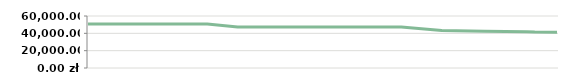
| Category | KWARTAŁ   |
|---|---|
| 2013-04-23 | 50800 |
| 2013-04-25 | 50800 |
| 2013-05-07 | 50800 |
| 2013-05-14 | 50800 |
| 2013-05-14 | 50800 |
| 2013-05-29 | 50800 |
| 2013-06-10 | 50800 |
| 2013-06-21 | 50800 |
| 2013-07-06 | 47400 |
| 2013-08-05 | 47400 |
| 2013-08-19 | 47400 |
| 2013-09-04 | 47400 |
| 2013-09-20 | 47400 |
| 2013-09-25 | 47400 |
| 2013-10-15 | 43258.14 |
| 2013-11-05 | 42312.903 |
| 2013-11-26 | 41811.111 |
| 2013-11-30 | 41500 |
| 2013-12-11 | 41288.235 |